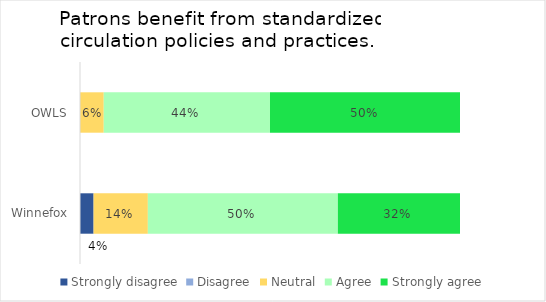
| Category | Strongly disagree | Disagree | Neutral | Agree | Strongly agree |
|---|---|---|---|---|---|
| OWLS | 0 | 0 | 0.062 | 0.438 | 0.5 |
| Winnefox | 0.036 | 0 | 0.143 | 0.5 | 0.321 |